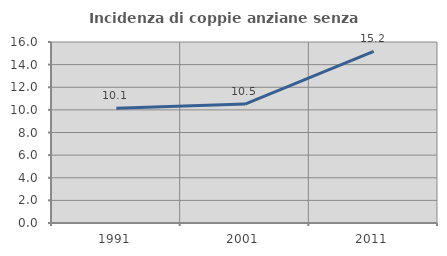
| Category | Incidenza di coppie anziane senza figli  |
|---|---|
| 1991.0 | 10.145 |
| 2001.0 | 10.511 |
| 2011.0 | 15.169 |